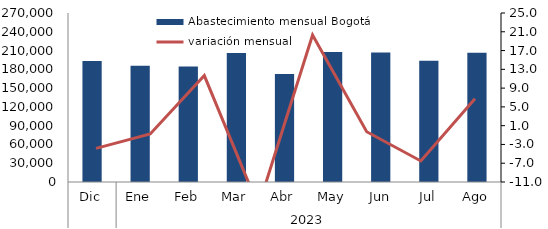
| Category | Abastecimiento mensual Bogotá |
|---|---|
| 0 | 193285.843 |
| 1 | 185878.431 |
| 2 | 184433.128 |
| 3 | 205951.614 |
| 4 | 172604.503 |
| 5 | 207645.455 |
| 6 | 207031.626 |
| 7 | 193540.689 |
| 8 | 206595.389 |